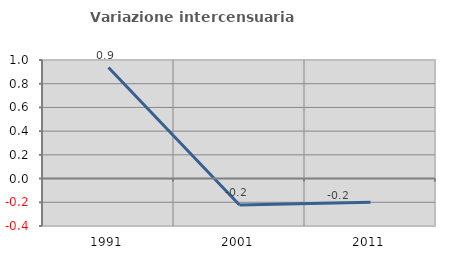
| Category | Variazione intercensuaria annua |
|---|---|
| 1991.0 | 0.936 |
| 2001.0 | -0.222 |
| 2011.0 | -0.199 |